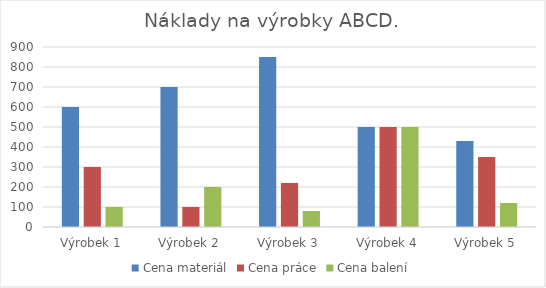
| Category | Cena materiál | Cena práce | Cena balení |
|---|---|---|---|
| Výrobek 1 | 600 | 300 | 100 |
| Výrobek 2 | 700 | 100 | 200 |
| Výrobek 3 | 850 | 220 | 80 |
| Výrobek 4 | 500 | 500 | 500 |
| Výrobek 5 | 430 | 350 | 120 |